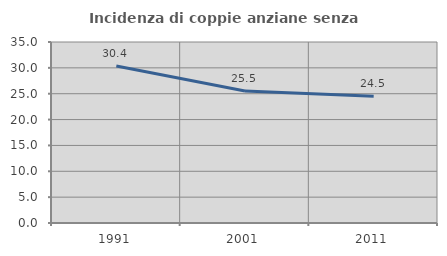
| Category | Incidenza di coppie anziane senza figli  |
|---|---|
| 1991.0 | 30.357 |
| 2001.0 | 25.532 |
| 2011.0 | 24.49 |